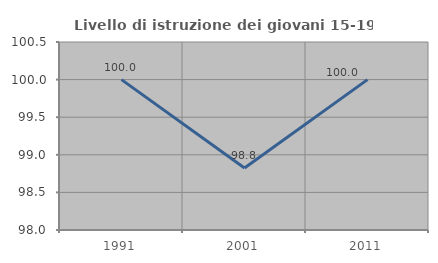
| Category | Livello di istruzione dei giovani 15-19 anni |
|---|---|
| 1991.0 | 100 |
| 2001.0 | 98.824 |
| 2011.0 | 100 |